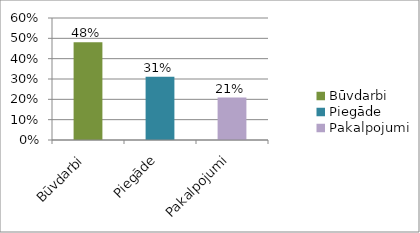
| Category | Series 0 |
|---|---|
| Būvdarbi | 0.48 |
| Piegāde | 0.311 |
| Pakalpojumi | 0.209 |